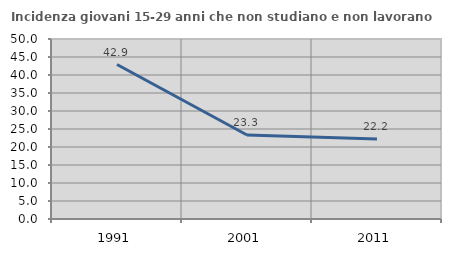
| Category | Incidenza giovani 15-29 anni che non studiano e non lavorano  |
|---|---|
| 1991.0 | 42.91 |
| 2001.0 | 23.333 |
| 2011.0 | 22.222 |